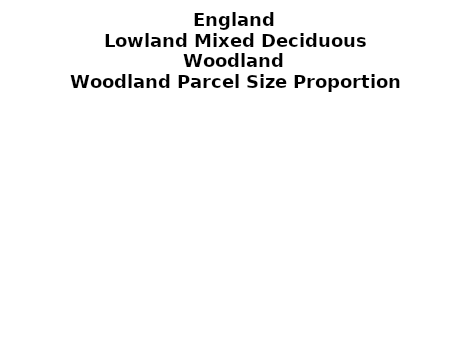
| Category | Lowland Mixed Deciduous Woodland |
|---|---|
| <5 ha | 0.248 |
| ≥5 and <10 ha | 0.116 |
| ≥10 and <15 ha | 0.076 |
| ≥15 and <20 ha | 0.047 |
| ≥20 and <25 ha | 0.041 |
| ≥25 and <30 ha | 0.035 |
| ≥30 and <35 ha | 0.032 |
| ≥35 and <40 ha | 0.022 |
| ≥40 and <45 ha | 0.022 |
| ≥45 and <50 ha | 0.018 |
| ≥50 and <60 ha | 0.038 |
| ≥60 and <70 ha | 0.029 |
| ≥70 and <80 ha | 0.025 |
| ≥80 and <90 ha | 0.022 |
| ≥90 and <100 ha | 0.02 |
| ≥100 and <150 ha | 0.06 |
| ≥150 and <200 ha | 0.04 |
| ≥200 ha | 0.109 |